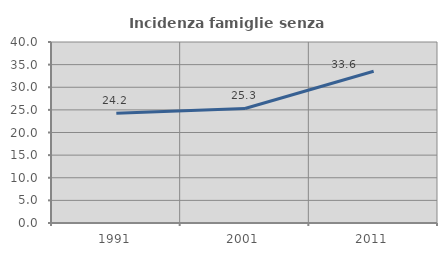
| Category | Incidenza famiglie senza nuclei |
|---|---|
| 1991.0 | 24.24 |
| 2001.0 | 25.308 |
| 2011.0 | 33.55 |